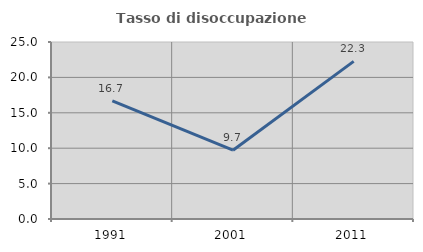
| Category | Tasso di disoccupazione giovanile  |
|---|---|
| 1991.0 | 16.679 |
| 2001.0 | 9.713 |
| 2011.0 | 22.26 |